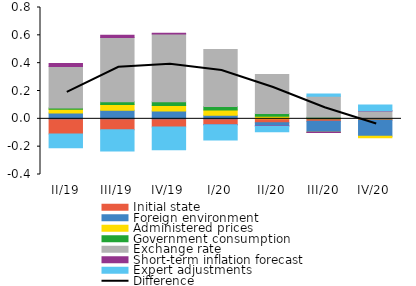
| Category | Initial state | Foreign environment | Administered prices | Government consumption | Exchange rate | Short-term inflation forecast  | Expert adjustments |
|---|---|---|---|---|---|---|---|
| II/19 | -0.109 | 0.041 | 0.028 | 0.009 | 0.298 | 0.022 | -0.099 |
| III/19 | -0.079 | 0.062 | 0.041 | 0.02 | 0.462 | 0.016 | -0.152 |
| IV/19 | -0.059 | 0.057 | 0.039 | 0.027 | 0.487 | 0.005 | -0.163 |
| I/20 | -0.042 | 0.026 | 0.037 | 0.026 | 0.41 | -0.002 | -0.108 |
| II/20 | -0.028 | -0.022 | 0.018 | 0.019 | 0.281 | -0.003 | -0.04 |
| III/20 | -0.018 | -0.079 | 0 | 0.011 | 0.152 | -0.001 | 0.015 |
| IV/20 | -0.01 | -0.115 | -0.011 | 0.005 | 0.052 | 0.001 | 0.04 |